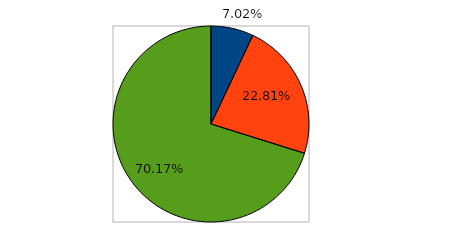
| Category | Series 0 |
|---|---|
| 0 | 0.07 |
| 1 | 0.228 |
| 2 | 0.702 |